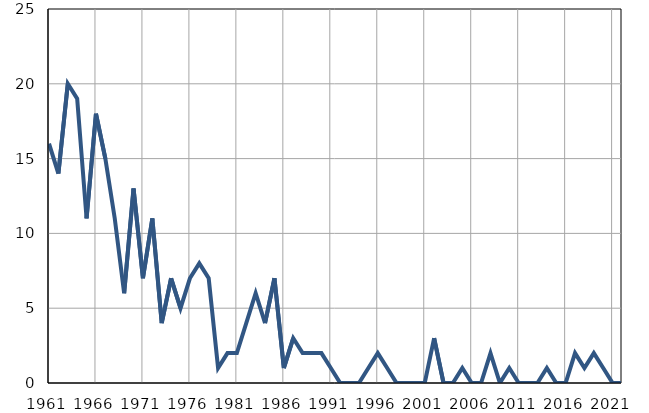
| Category | Умрла 
одојчад |
|---|---|
| 1961.0 | 16 |
| 1962.0 | 14 |
| 1963.0 | 20 |
| 1964.0 | 19 |
| 1965.0 | 11 |
| 1966.0 | 18 |
| 1967.0 | 15 |
| 1968.0 | 11 |
| 1969.0 | 6 |
| 1970.0 | 13 |
| 1971.0 | 7 |
| 1972.0 | 11 |
| 1973.0 | 4 |
| 1974.0 | 7 |
| 1975.0 | 5 |
| 1976.0 | 7 |
| 1977.0 | 8 |
| 1978.0 | 7 |
| 1979.0 | 1 |
| 1980.0 | 2 |
| 1981.0 | 2 |
| 1982.0 | 4 |
| 1983.0 | 6 |
| 1984.0 | 4 |
| 1985.0 | 7 |
| 1986.0 | 1 |
| 1987.0 | 3 |
| 1988.0 | 2 |
| 1989.0 | 2 |
| 1990.0 | 2 |
| 1991.0 | 1 |
| 1992.0 | 0 |
| 1993.0 | 0 |
| 1994.0 | 0 |
| 1995.0 | 1 |
| 1996.0 | 2 |
| 1997.0 | 1 |
| 1998.0 | 0 |
| 1999.0 | 0 |
| 2000.0 | 0 |
| 2001.0 | 0 |
| 2002.0 | 3 |
| 2003.0 | 0 |
| 2004.0 | 0 |
| 2005.0 | 1 |
| 2006.0 | 0 |
| 2007.0 | 0 |
| 2008.0 | 2 |
| 2009.0 | 0 |
| 2010.0 | 1 |
| 2011.0 | 0 |
| 2012.0 | 0 |
| 2013.0 | 0 |
| 2014.0 | 1 |
| 2015.0 | 0 |
| 2016.0 | 0 |
| 2017.0 | 2 |
| 2018.0 | 1 |
| 2019.0 | 2 |
| 2020.0 | 1 |
| 2021.0 | 0 |
| 2022.0 | 0 |